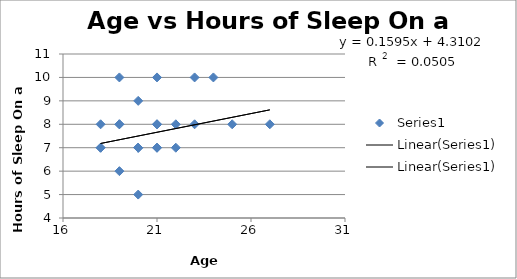
| Category | Series 0 |
|---|---|
| 21.0 | 3 |
| 19.0 | 10 |
| 22.0 | 7 |
| 21.0 | 10 |
| 18.0 | 7 |
| 20.0 | 5 |
| 20.0 | 7 |
| 21.0 | 7 |
| 25.0 | 8 |
| 21.0 | 8 |
| 24.0 | 10 |
| 19.0 | 6 |
| 18.0 | 7 |
| 27.0 | 8 |
| 20.0 | 9 |
| 19.0 | 8 |
| 21.0 | 7 |
| 22.0 | 8 |
| 23.0 | 8 |
| 23.0 | 10 |
| 21.0 | 8 |
| 20.0 | 7 |
| 18.0 | 8 |
| 19.0 | 8 |
| 20.0 | 7 |